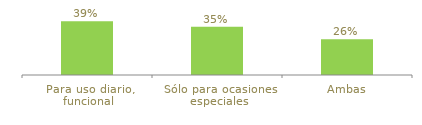
| Category | Series 0 |
|---|---|
| Para uso diario, funcional | 0.39 |
| Sólo para ocasiones especiales | 0.35 |
| Ambas | 0.26 |